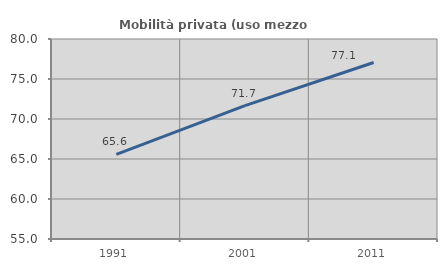
| Category | Mobilità privata (uso mezzo privato) |
|---|---|
| 1991.0 | 65.574 |
| 2001.0 | 71.68 |
| 2011.0 | 77.061 |